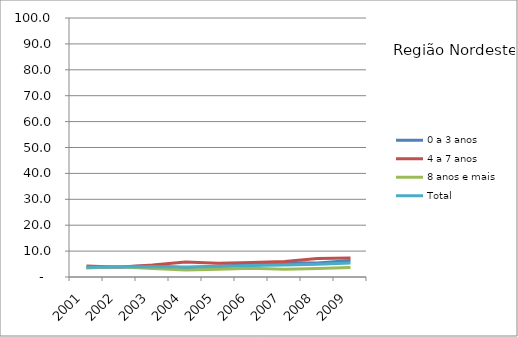
| Category | 0 a 3 anos | 4 a 7 anos | 8 anos e mais | Total |
|---|---|---|---|---|
| 2001.0 | 3.7 | 4.2 | 3.5 | 3.8 |
| 2002.0 | 4 | 3.8 | 4 | 3.9 |
| 2003.0 | 4.3 | 4.6 | 3.3 | 4 |
| 2004.0 | 3.6 | 5.8 | 2.7 | 3.9 |
| 2005.0 | 4.2 | 5.3 | 3 | 4.1 |
| 2006.0 | 4.6 | 5.6 | 3.4 | 4.4 |
| 2007.0 | 5.5 | 6 | 3 | 4.6 |
| 2008.0 | 5.4 | 7.1 | 3.3 | 4.9 |
| 2009.0 | 6.4 | 7.3 | 3.7 | 5.4 |